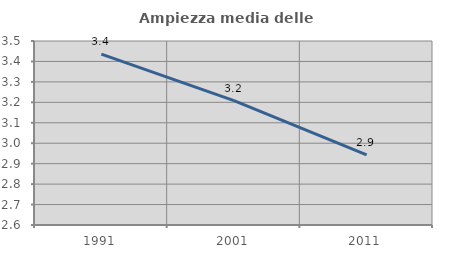
| Category | Ampiezza media delle famiglie |
|---|---|
| 1991.0 | 3.436 |
| 2001.0 | 3.208 |
| 2011.0 | 2.943 |